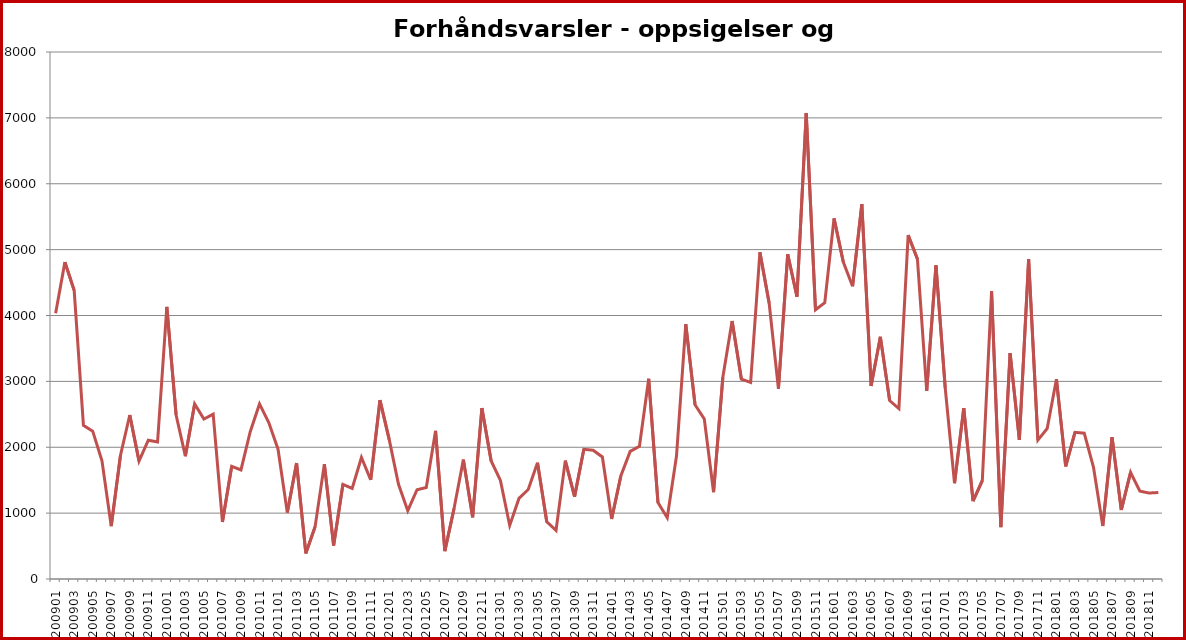
| Category | Series 1 |
|---|---|
| 200901.0 | 4035 |
| 200902.0 | 4810 |
| 200903.0 | 4381 |
| 200904.0 | 2332 |
| 200905.0 | 2245 |
| 200906.0 | 1794 |
| 200907.0 | 802 |
| 200908.0 | 1879 |
| 200909.0 | 2489 |
| 200910.0 | 1789 |
| 200911.0 | 2107 |
| 200912.0 | 2080 |
| 201001.0 | 4130 |
| 201002.0 | 2490 |
| 201003.0 | 1865 |
| 201004.0 | 2658 |
| 201005.0 | 2427 |
| 201006.0 | 2503 |
| 201007.0 | 866 |
| 201008.0 | 1711 |
| 201009.0 | 1655 |
| 201010.0 | 2235 |
| 201011.0 | 2658 |
| 201012.0 | 2374 |
| 201101.0 | 1971 |
| 201102.0 | 1008 |
| 201103.0 | 1759 |
| 201104.0 | 389 |
| 201105.0 | 794 |
| 201106.0 | 1744 |
| 201107.0 | 509 |
| 201108.0 | 1436 |
| 201109.0 | 1374 |
| 201110.0 | 1844 |
| 201111.0 | 1504 |
| 201112.0 | 2714 |
| 201201.0 | 2115 |
| 201202.0 | 1437 |
| 201203.0 | 1037 |
| 201204.0 | 1355 |
| 201205.0 | 1390 |
| 201206.0 | 2249 |
| 201207.0 | 423 |
| 201208.0 | 1073 |
| 201209.0 | 1812 |
| 201210.0 | 937 |
| 201211.0 | 2594 |
| 201212.0 | 1792 |
| 201301.0 | 1496 |
| 201302.0 | 813 |
| 201303.0 | 1223 |
| 201304.0 | 1358 |
| 201305.0 | 1765 |
| 201306.0 | 869 |
| 201307.0 | 738 |
| 201308.0 | 1797 |
| 201309.0 | 1250 |
| 201310.0 | 1969 |
| 201311.0 | 1954 |
| 201312.0 | 1853 |
| 201401.0 | 910 |
| 201402.0 | 1568 |
| 201403.0 | 1937 |
| 201404.0 | 2014 |
| 201405.0 | 3040 |
| 201406.0 | 1160 |
| 201407.0 | 929 |
| 201408.0 | 1866 |
| 201409.0 | 3868 |
| 201410.0 | 2646 |
| 201411.0 | 2429 |
| 201412.0 | 1317 |
| 201501.0 | 3062 |
| 201502.0 | 3915 |
| 201503.0 | 3035 |
| 201504.0 | 2985 |
| 201505.0 | 4960 |
| 201506.0 | 4185 |
| 201507.0 | 2888 |
| 201508.0 | 4930 |
| 201509.0 | 4286 |
| 201510.0 | 7072 |
| 201511.0 | 4087 |
| 201512.0 | 4193 |
| 201601.0 | 5475 |
| 201602.0 | 4812 |
| 201603.0 | 4444 |
| 201604.0 | 5691 |
| 201605.0 | 2931 |
| 201606.0 | 3676 |
| 201607.0 | 2709 |
| 201608.0 | 2588 |
| 201609.0 | 5220 |
| 201610.0 | 4857 |
| 201611.0 | 2855 |
| 201612.0 | 4761 |
| 201701.0 | 2898 |
| 201702.0 | 1454 |
| 201703.0 | 2594 |
| 201704.0 | 1182 |
| 201705.0 | 1494 |
| 201706.0 | 4368 |
| 201707.0 | 787 |
| 201708.0 | 3429 |
| 201709.0 | 2112 |
| 201710.0 | 4854 |
| 201711.0 | 2109 |
| 201712.0 | 2284 |
| 201801.0 | 3032 |
| 201802.0 | 1711 |
| 201803.0 | 2227 |
| 201804.0 | 2213 |
| 201805.0 | 1696 |
| 201806.0 | 805 |
| 201807.0 | 2153 |
| 201808.0 | 1048 |
| 201809.0 | 1619 |
| 201810.0 | 1334 |
| 201811.0 | 1305 |
| 201812.0 | 1313 |